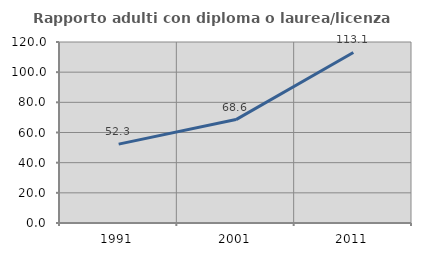
| Category | Rapporto adulti con diploma o laurea/licenza media  |
|---|---|
| 1991.0 | 52.308 |
| 2001.0 | 68.559 |
| 2011.0 | 113.074 |